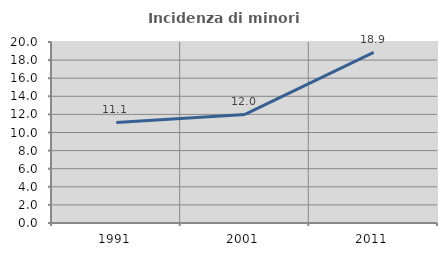
| Category | Incidenza di minori stranieri |
|---|---|
| 1991.0 | 11.111 |
| 2001.0 | 12 |
| 2011.0 | 18.852 |